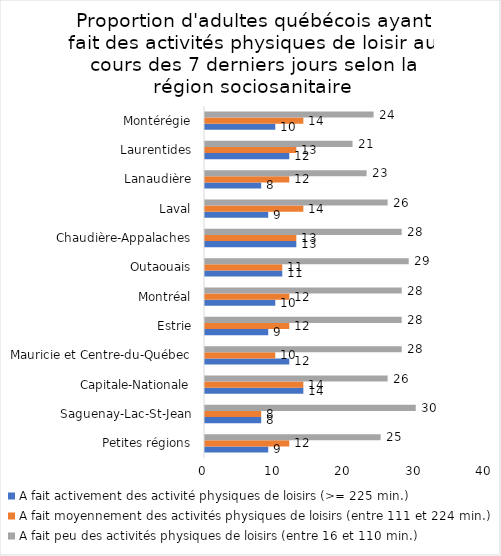
| Category | A fait activement des activité physiques de loisirs (>= 225 min.) | A fait moyennement des activités physiques de loisirs (entre 111 et 224 min.) | A fait peu des activités physiques de loisirs (entre 16 et 110 min.) |
|---|---|---|---|
| Petites régions | 9 | 12 | 25 |
| Saguenay-Lac-St-Jean | 8 | 8 | 30 |
| Capitale-Nationale | 14 | 14 | 26 |
| Mauricie et Centre-du-Québec | 12 | 10 | 28 |
| Estrie | 9 | 12 | 28 |
| Montréal | 10 | 12 | 28 |
| Outaouais | 11 | 11 | 29 |
| Chaudière-Appalaches | 13 | 13 | 28 |
| Laval | 9 | 14 | 26 |
| Lanaudière | 8 | 12 | 23 |
| Laurentides | 12 | 13 | 21 |
| Montérégie | 10 | 14 | 24 |